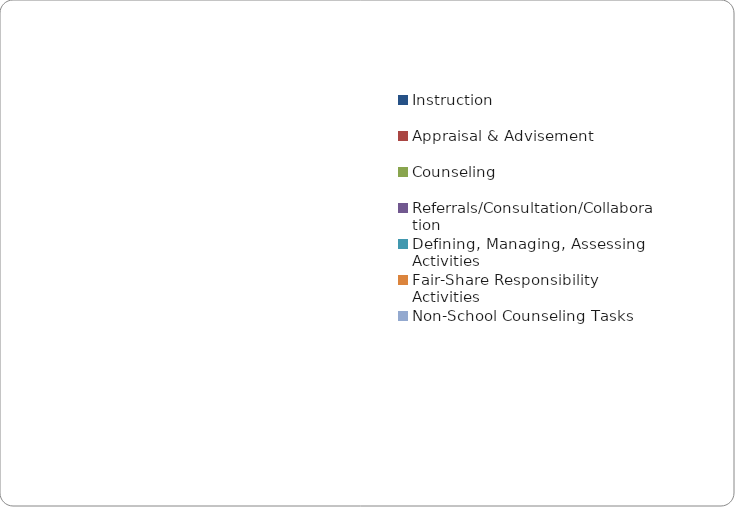
| Category | Series 0 |
|---|---|
| Instruction | 0 |
| Appraisal & Advisement | 0 |
| Counseling | 0 |
| Referrals/Consultation/Collaboration | 0 |
| Defining, Managing, Assessing Activities | 0 |
| Fair-Share Responsibility Activities | 0 |
| Non-School Counseling Tasks | 0 |